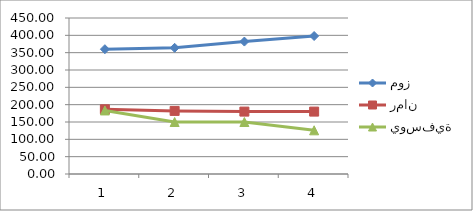
| Category | موز | رمان | يوسفية |
|---|---|---|---|
| 0 | 360 | 186.667 | 183.333 |
| 1 | 364 | 182 | 150 |
| 2 | 382 | 180 | 150 |
| 3 | 398 | 180 | 126 |